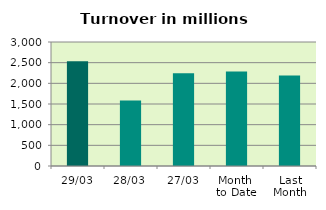
| Category | Series 0 |
|---|---|
| 29/03 | 2536.994 |
| 28/03 | 1584.454 |
| 27/03 | 2242.055 |
| Month 
to Date | 2286.259 |
| Last
Month | 2191.938 |